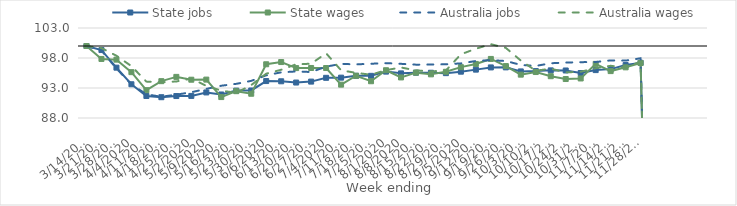
| Category | State jobs | State wages | Australia jobs | Australia wages |
|---|---|---|---|---|
| 14/03/2020 | 100 | 100 | 100 | 100 |
| 21/03/2020 | 99.324 | 97.844 | 99.244 | 99.654 |
| 28/03/2020 | 96.388 | 97.729 | 96.24 | 98.376 |
| 04/04/2020 | 93.623 | 95.64 | 93.611 | 96.647 |
| 11/04/2020 | 91.667 | 92.639 | 91.951 | 94.065 |
| 18/04/2020 | 91.464 | 94.14 | 91.54 | 93.96 |
| 25/04/2020 | 91.661 | 94.852 | 91.89 | 94.086 |
| 02/05/2020 | 91.68 | 94.382 | 92.294 | 94.563 |
| 09/05/2020 | 92.259 | 94.399 | 92.851 | 93.362 |
| 16/05/2020 | 91.92 | 91.489 | 93.38 | 92.559 |
| 23/05/2020 | 92.564 | 92.47 | 93.691 | 92.191 |
| 30/05/2020 | 92.588 | 92.042 | 94.189 | 93.489 |
| 06/06/2020 | 94.159 | 96.954 | 95.112 | 95.384 |
| 13/06/2020 | 94.12 | 97.325 | 95.61 | 96.041 |
| 20/06/2020 | 93.91 | 96.317 | 95.758 | 96.951 |
| 27/06/2020 | 94.066 | 96.337 | 95.662 | 97.048 |
| 04/07/2020 | 94.698 | 96.329 | 96.562 | 98.782 |
| 11/07/2020 | 94.724 | 93.557 | 97.02 | 95.951 |
| 18/07/2020 | 95.035 | 95.039 | 96.939 | 95.522 |
| 25/07/2020 | 95.028 | 94.127 | 97.042 | 95.21 |
| 01/08/2020 | 95.729 | 95.961 | 97.145 | 95.98 |
| 08/08/2020 | 95.44 | 94.761 | 97.028 | 96.418 |
| 15/08/2020 | 95.552 | 95.559 | 96.891 | 95.936 |
| 22/08/2020 | 95.542 | 95.275 | 96.912 | 95.768 |
| 29/08/2020 | 95.476 | 95.705 | 96.951 | 95.924 |
| 05/09/2020 | 95.72 | 96.476 | 97.102 | 98.618 |
| 12/09/2020 | 96.062 | 97.008 | 97.5 | 99.542 |
| 19/09/2020 | 96.43 | 97.844 | 97.636 | 100.304 |
| 26/09/2020 | 96.438 | 96.656 | 97.498 | 99.685 |
| 03/10/2020 | 95.764 | 95.226 | 96.847 | 97.575 |
| 10/10/2020 | 95.819 | 95.659 | 96.677 | 95.876 |
| 17/10/2020 | 95.94 | 94.965 | 97.124 | 96.224 |
| 24/10/2020 | 95.92 | 94.496 | 97.241 | 95.599 |
| 31/10/2020 | 95.5 | 94.589 | 97.306 | 95.715 |
| 07/11/2020 | 95.983 | 97.018 | 97.335 | 96.299 |
| 14/11/2020 | 96.145 | 95.818 | 97.6 | 96.705 |
| 21/11/2020 | 96.823 | 96.445 | 97.567 | 96.396 |
| 28/11/2020 | 97.199 | 97.168 | 97.955 | 97.416 |